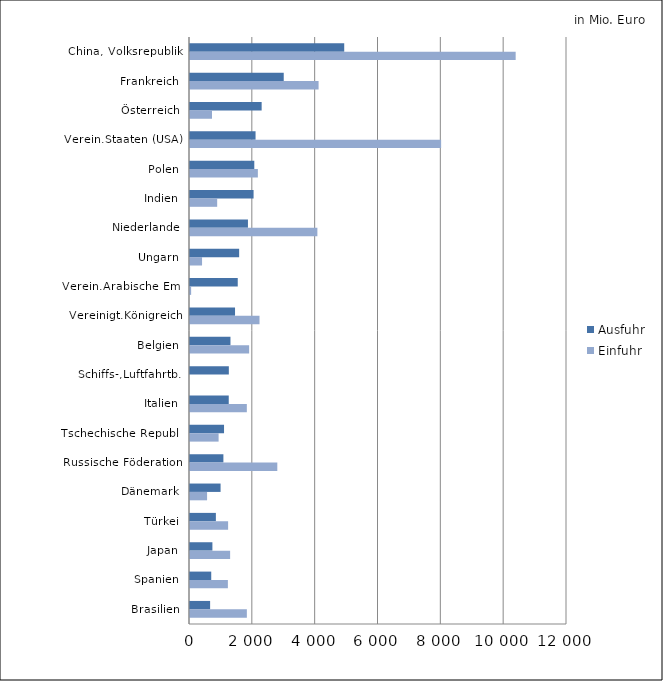
| Category | Ausfuhr | Einfuhr |
|---|---|---|
| China, Volksrepublik | 4908.884 | 10365.976 |
| Frankreich | 2983.545 | 4093.016 |
| Österreich | 2280.556 | 700.083 |
| Verein.Staaten (USA) | 2086.627 | 7993.459 |
| Polen | 2046.577 | 2160.123 |
| Indien | 2023.782 | 865.048 |
| Niederlande | 1844.581 | 4054.593 |
| Ungarn | 1564.415 | 383.55 |
| Verein.Arabische Em. | 1519.843 | 36.285 |
| Vereinigt.Königreich | 1433.576 | 2212.897 |
| Belgien | 1288.055 | 1882.245 |
| Schiffs-,Luftfahrtb. | 1236.275 | 0 |
| Italien | 1233.181 | 1809.094 |
| Tschechische Republ. | 1083.4 | 910.492 |
| Russische Föderation | 1062.879 | 2778.946 |
| Dänemark | 973.233 | 543.591 |
| Türkei | 823.632 | 1213.075 |
| Japan | 713.069 | 1277.102 |
| Spanien | 676.032 | 1205.798 |
| Brasilien | 640.364 | 1809.794 |